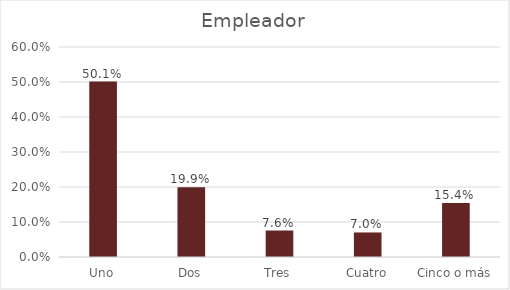
| Category | Empleador |
|---|---|
| Uno | 0.501 |
| Dos | 0.199 |
| Tres | 0.076 |
| Cuatro | 0.07 |
| Cinco o más | 0.154 |